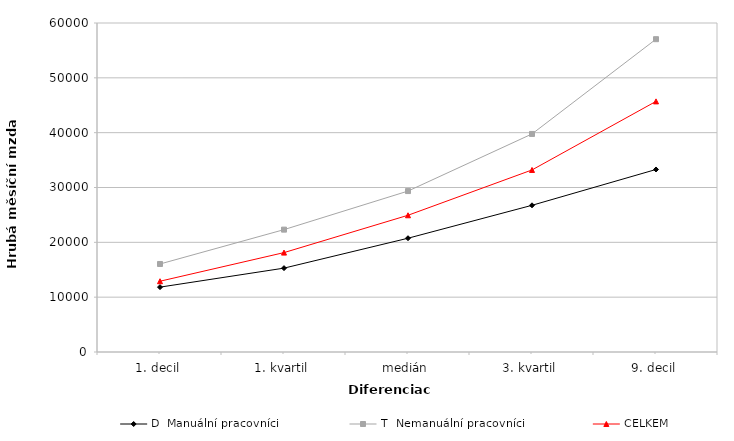
| Category | D  Manuální pracovníci | T  Nemanuální pracovníci | CELKEM |
|---|---|---|---|
| 1. decil | 11829.972 | 16049.558 | 12907.831 |
| 1. kvartil | 15295.994 | 22316.311 | 18128.113 |
| medián | 20749.295 | 29348.632 | 24934.188 |
| 3. kvartil | 26752.966 | 39767.712 | 33202.498 |
| 9. decil | 33287.339 | 57049.949 | 45704.935 |